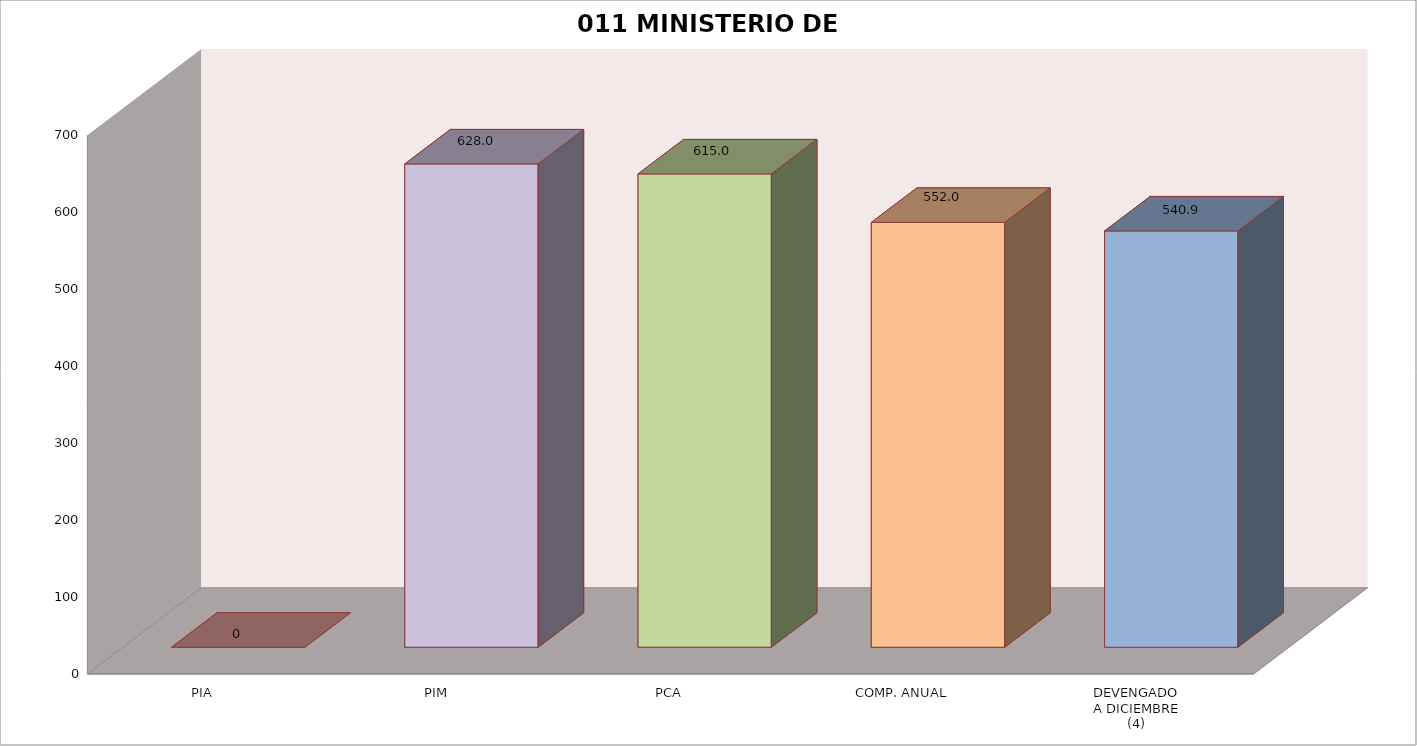
| Category | 011 MINISTERIO DE SALUD |
|---|---|
| PIA | 0 |
| PIM | 627.98 |
| PCA | 615.003 |
| COMP. ANUAL | 552.005 |
| DEVENGADO
A DICIEMBRE
(4) | 540.873 |